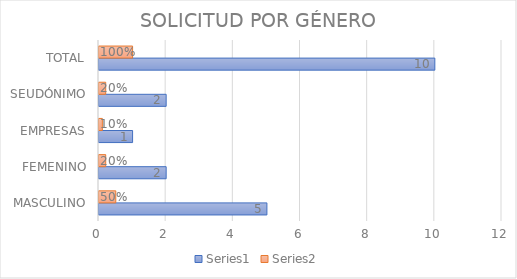
| Category | Series 0 | Series 1 |
|---|---|---|
| MASCULINO | 5 | 0.5 |
| FEMENINO | 2 | 0.2 |
| EMPRESAS | 1 | 0.1 |
| SEUDÓNIMO | 2 | 0.2 |
| TOTAL | 10 | 1 |